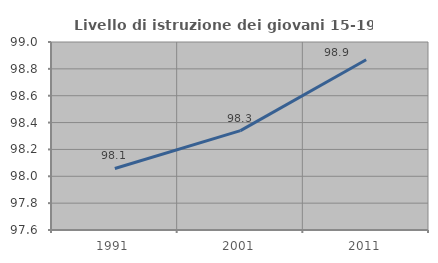
| Category | Livello di istruzione dei giovani 15-19 anni |
|---|---|
| 1991.0 | 98.058 |
| 2001.0 | 98.34 |
| 2011.0 | 98.868 |